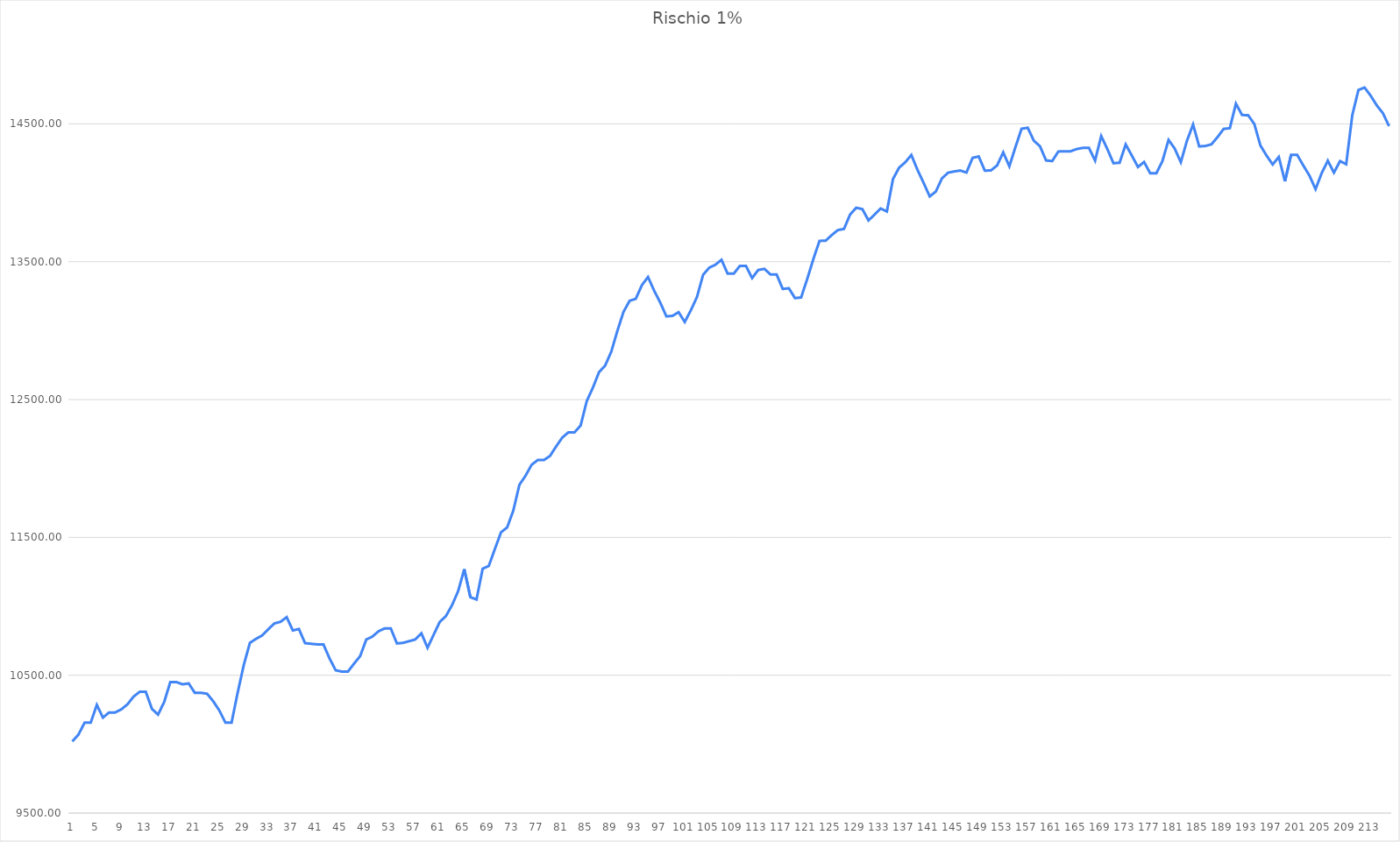
| Category | Series 0 |
|---|---|
| 0 | 10020 |
| 1 | 10069.28 |
| 2 | 10155.52 |
| 3 | 10155.52 |
| 4 | 10285 |
| 5 | 10192.84 |
| 6 | 10230.04 |
| 7 | 10230.04 |
| 8 | 10252.44 |
| 9 | 10288.92 |
| 10 | 10345.02 |
| 11 | 10379.74 |
| 12 | 10379.74 |
| 13 | 10256.092 |
| 14 | 10214.232 |
| 15 | 10305.992 |
| 16 | 10450.412 |
| 17 | 10450.412 |
| 18 | 10434.412 |
| 19 | 10440.812 |
| 20 | 10372.492 |
| 21 | 10372.492 |
| 22 | 10365.932 |
| 23 | 10311.992 |
| 24 | 10245.032 |
| 25 | 10156.072 |
| 26 | 10156.072 |
| 27 | 10373.672 |
| 28 | 10575.272 |
| 29 | 10735.272 |
| 30 | 10764.072 |
| 31 | 10788.552 |
| 32 | 10834.122 |
| 33 | 10875.972 |
| 34 | 10887.732 |
| 35 | 10921.584 |
| 36 | 10825.152 |
| 37 | 10835.392 |
| 38 | 10732.992 |
| 39 | 10728.192 |
| 40 | 10723.872 |
| 41 | 10723.872 |
| 42 | 10622.442 |
| 43 | 10536.122 |
| 44 | 10526.522 |
| 45 | 10526.522 |
| 46 | 10584.074 |
| 47 | 10639.01 |
| 48 | 10759.01 |
| 49 | 10780.61 |
| 50 | 10818.986 |
| 51 | 10839.656 |
| 52 | 10839.656 |
| 53 | 10730.856 |
| 54 | 10734.84 |
| 55 | 10747.32 |
| 56 | 10759.32 |
| 57 | 10804.32 |
| 58 | 10699.36 |
| 59 | 10794 |
| 60 | 10886.95 |
| 61 | 10928.95 |
| 62 | 11008.15 |
| 63 | 11110.15 |
| 64 | 11269.61 |
| 65 | 11066.26 |
| 66 | 11049.66 |
| 67 | 11272.77 |
| 68 | 11292.93 |
| 69 | 11416.21 |
| 70 | 11537.17 |
| 71 | 11572.45 |
| 72 | 11693.41 |
| 73 | 11881.57 |
| 74 | 11947.09 |
| 75 | 12026.962 |
| 76 | 12061.266 |
| 77 | 12061.266 |
| 78 | 12091.016 |
| 79 | 12160.036 |
| 80 | 12224.1 |
| 81 | 12262.156 |
| 82 | 12262.156 |
| 83 | 12312.004 |
| 84 | 12488.884 |
| 85 | 12586.164 |
| 86 | 12698.804 |
| 87 | 12746.324 |
| 88 | 12847.124 |
| 89 | 12998.324 |
| 90 | 13136.324 |
| 91 | 13216.564 |
| 92 | 13230.724 |
| 93 | 13329.724 |
| 94 | 13389.196 |
| 95 | 13290.396 |
| 96 | 13203.276 |
| 97 | 13103.676 |
| 98 | 13107.276 |
| 99 | 13133.836 |
| 100 | 13063.036 |
| 101 | 13147.996 |
| 102 | 13244.608 |
| 103 | 13405.408 |
| 104 | 13456.608 |
| 105 | 13478.112 |
| 106 | 13514.112 |
| 107 | 13413.336 |
| 108 | 13413.336 |
| 109 | 13469.686 |
| 110 | 13469.686 |
| 111 | 13381.126 |
| 112 | 13440.166 |
| 113 | 13448.326 |
| 114 | 13407.558 |
| 115 | 13407.558 |
| 116 | 13302.558 |
| 117 | 13307.418 |
| 118 | 13236.138 |
| 119 | 13240.512 |
| 120 | 13374.912 |
| 121 | 13518.962 |
| 122 | 13651.262 |
| 123 | 13652.35 |
| 124 | 13693.286 |
| 125 | 13729.574 |
| 126 | 13737.926 |
| 127 | 13842.758 |
| 128 | 13891.478 |
| 129 | 13882.038 |
| 130 | 13799.438 |
| 131 | 13842.446 |
| 132 | 13886.222 |
| 133 | 13864.112 |
| 134 | 14099.632 |
| 135 | 14182.432 |
| 136 | 14221.24 |
| 137 | 14274.37 |
| 138 | 14166.57 |
| 139 | 14072.19 |
| 140 | 13973.63 |
| 141 | 14009.27 |
| 142 | 14104.97 |
| 143 | 14145.78 |
| 144 | 14154.98 |
| 145 | 14161.47 |
| 146 | 14147.118 |
| 147 | 14253.588 |
| 148 | 14263.598 |
| 149 | 14160.558 |
| 150 | 14162.868 |
| 151 | 14198.386 |
| 152 | 14293.306 |
| 153 | 14192.128 |
| 154 | 14332.268 |
| 155 | 14464.708 |
| 156 | 14472.068 |
| 157 | 14377.988 |
| 158 | 14337.788 |
| 159 | 14234.748 |
| 160 | 14230.284 |
| 161 | 14299.584 |
| 162 | 14301.222 |
| 163 | 14301.222 |
| 164 | 14317.542 |
| 165 | 14325.702 |
| 166 | 14325.702 |
| 167 | 14233.722 |
| 168 | 14412.138 |
| 169 | 14317.482 |
| 170 | 14214.782 |
| 171 | 14217.942 |
| 172 | 14350.782 |
| 173 | 14270.328 |
| 174 | 14187.128 |
| 175 | 14223.728 |
| 176 | 14141.648 |
| 177 | 14141.648 |
| 178 | 14230.672 |
| 179 | 14383.682 |
| 180 | 14320.97 |
| 181 | 14221.85 |
| 182 | 14377.37 |
| 183 | 14495.77 |
| 184 | 14336.722 |
| 185 | 14339.698 |
| 186 | 14351.578 |
| 187 | 14404.334 |
| 188 | 14463.69 |
| 189 | 14468.82 |
| 190 | 14646.66 |
| 191 | 14564.404 |
| 192 | 14562.292 |
| 193 | 14499.292 |
| 194 | 14342.876 |
| 195 | 14269.976 |
| 196 | 14205.296 |
| 197 | 14260.196 |
| 198 | 14083.208 |
| 199 | 14275.028 |
| 200 | 14275.028 |
| 201 | 14198.068 |
| 202 | 14125.072 |
| 203 | 14026.576 |
| 204 | 14142.736 |
| 205 | 14232.77 |
| 206 | 14146.45 |
| 207 | 14229.97 |
| 208 | 14207.29 |
| 209 | 14563.72 |
| 210 | 14746.072 |
| 211 | 14763.736 |
| 212 | 14704.216 |
| 213 | 14633.816 |
| 214 | 14577.368 |
| 215 | 14483.736 |